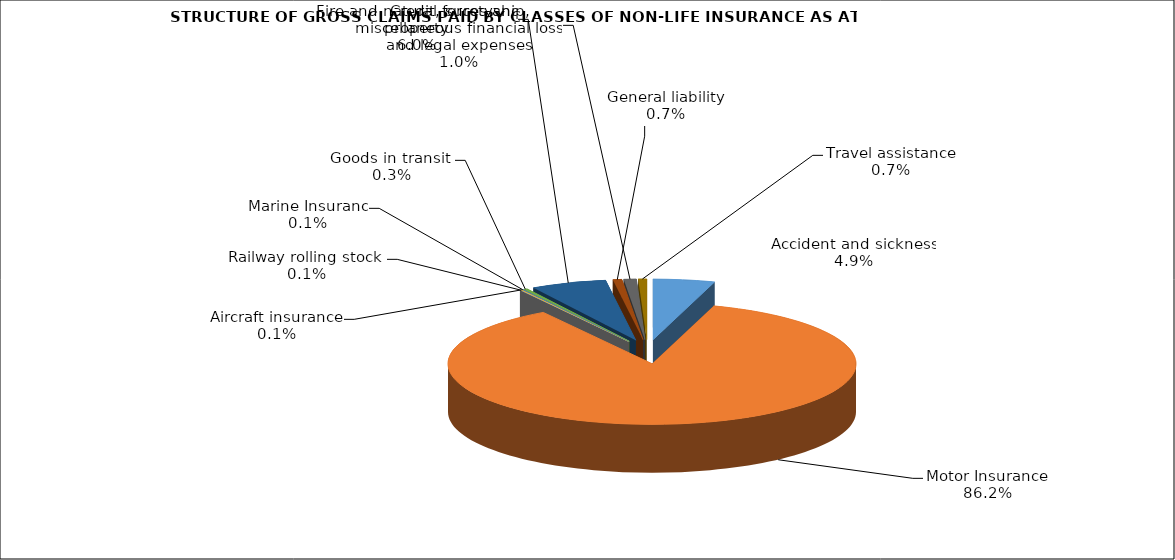
| Category | Accident and sickness | Series 1 |
|---|---|---|
| Accident and sickness | 0.049 |  |
| Motor Insurance | 0.862 |  |
| Railway rolling stock  | 0.001 |  |
| Aircraft insurance | 0.001 |  |
| Marine Insuranc | 0.001 |  |
| Goods in transit  | 0.003 |  |
| Fire and natural forces and property | 0.06 |  |
| General liability | 0.007 |  |
| Credit, suretyship, miscellaneous financial loss and legal expenses | 0.01 |  |
| Travel assistance | 0.007 |  |